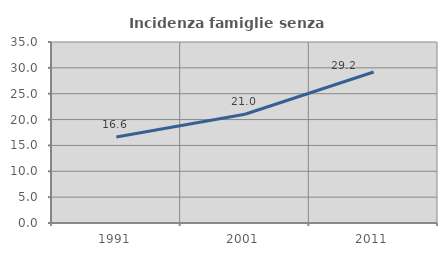
| Category | Incidenza famiglie senza nuclei |
|---|---|
| 1991.0 | 16.611 |
| 2001.0 | 21.031 |
| 2011.0 | 29.196 |